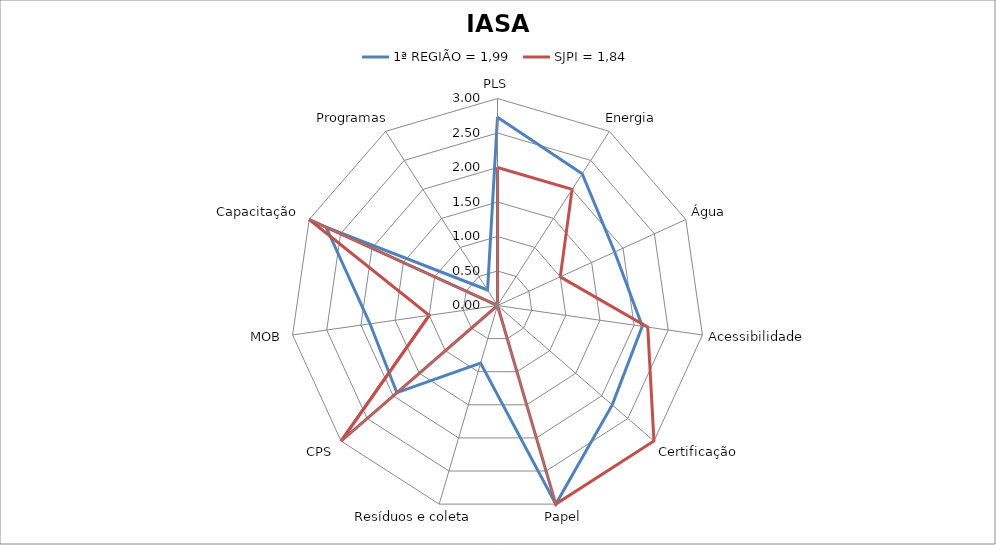
| Category | 1ª REGIÃO = 1,99 | SJPI = 1,84 |
|---|---|---|
| PLS | 2.73 | 2 |
| Energia | 2.27 | 2 |
| Água | 1.867 | 1 |
| Acessibilidade | 2.12 | 2.2 |
| Certificação | 2.2 | 3 |
| Papel | 3 | 3 |
| Resíduos e coleta | 0.87 | 0 |
| CPS | 1.93 | 3 |
| MOB | 1.867 | 1 |
| Capacitação | 2.73 | 3 |
| Programas | 0.267 | 0 |